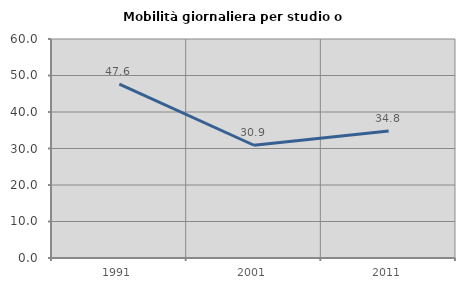
| Category | Mobilità giornaliera per studio o lavoro |
|---|---|
| 1991.0 | 47.642 |
| 2001.0 | 30.893 |
| 2011.0 | 34.803 |